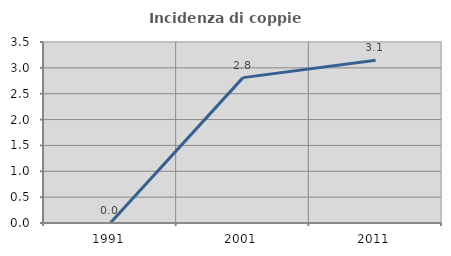
| Category | Incidenza di coppie miste |
|---|---|
| 1991.0 | 0 |
| 2001.0 | 2.811 |
| 2011.0 | 3.147 |